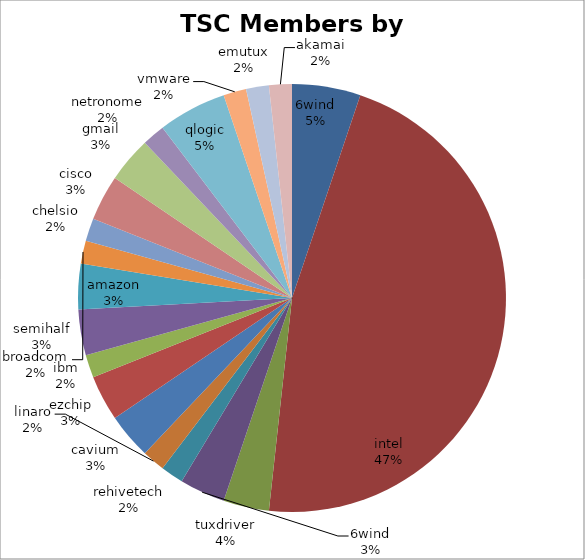
| Category | Series 0 |
|---|---|
| 6wind | 3 |
| intel | 27 |
| tuxdriver | 2 |
| 6wind | 2 |
| rehivetech | 1 |
| linaro | 1 |
| cavium | 2 |
| ezchip | 2 |
| ibm | 1 |
| semihalf | 2 |
| amazon | 2 |
| broadcom | 1 |
| chelsio | 1 |
| cisco | 2 |
| gmail | 2 |
| netronome | 1 |
| qlogic | 3 |
| vmware | 1 |
| emutux | 1 |
| akamai | 1 |